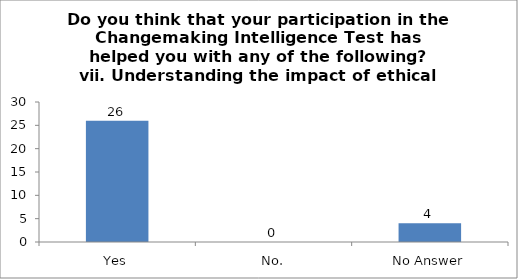
| Category | Do you think that your participation in the Changemaking Intelligence Test has helped you with any of the following?
vii. Understanding the impact of ethical choices. |
|---|---|
| Yes | 26 |
| No. | 0 |
| No Answer | 4 |